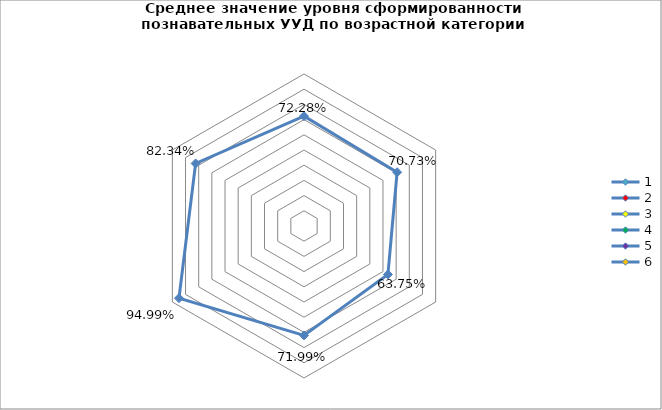
| Category | Series 0 |
|---|---|
| 0 | 0.723 |
| 1 | 0.707 |
| 2 | 0.637 |
| 3 | 0.72 |
| 4 | 0.95 |
| 5 | 0.823 |